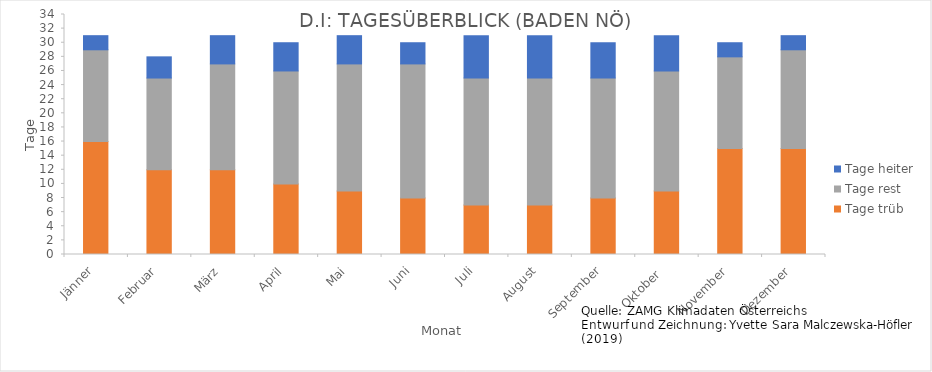
| Category | Tage trüb | Tage rest | Tage heiter |
|---|---|---|---|
| Jänner | 16 | 13 | 2 |
| Februar | 12 | 13 | 3 |
| März | 12 | 15 | 4 |
| April | 10 | 16 | 4 |
| Mai | 9 | 18 | 4 |
| Juni | 8 | 19 | 3 |
| Juli | 7 | 18 | 6 |
| August | 7 | 18 | 6 |
| September | 8 | 17 | 5 |
| Oktober  | 9 | 17 | 5 |
| November | 15 | 13 | 2 |
| Dezember | 15 | 14 | 2 |